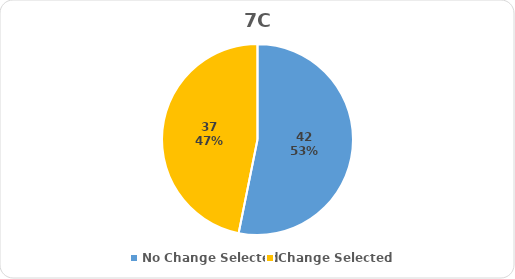
| Category | Series 0 |
|---|---|
| No Change Selected | 42 |
| Change Selected | 37 |